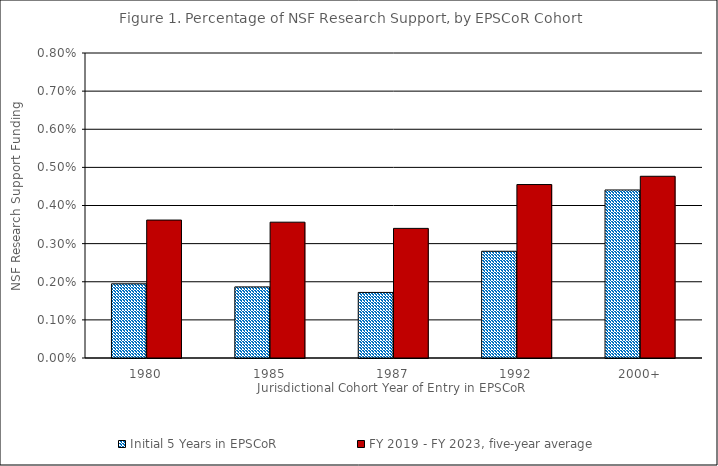
| Category | Initial 5 Years in EPSCoR | FY 2019 - FY 2023, five-year average |
|---|---|---|
| 1980 | 0.002 | 0.004 |
| 1985 | 0.002 | 0.004 |
| 1987 | 0.002 | 0.003 |
| 1992 | 0.003 | 0.005 |
| 2000+ | 0.004 | 0.005 |